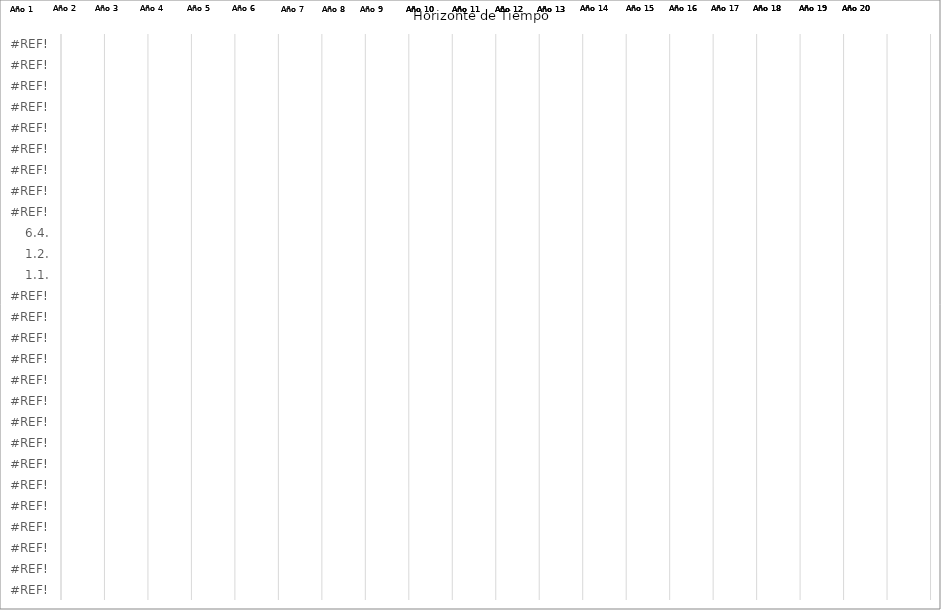
| Category | Series 2 | Series 3 | Series 0 | Series 1 |
|---|---|---|---|---|
| #¡REF! | 0 | 0 | 0 | 0 |
| #¡REF! | 0 | 0 | 0 | 0 |
| #¡REF! | 0 | 0 | 0 | 0 |
| #¡REF! | 0 | 0 | 0 | 0 |
| #¡REF! | 0 | 0 | 0 | 0 |
| #¡REF! | 0 | 0 | 0 | 0 |
| #¡REF! | 0 | 0 | 0 | 0 |
| #¡REF! | 0 | 0 | 0 | 0 |
| #¡REF! | 0 | 0 | 0 | 0 |
| #¡REF! | 0 | 0 | 0 | 0 |
| #¡REF! | 0 | 0 | 0 | 0 |
| #¡REF! | 0 | 0 | 0 | 0 |
| #¡REF! | 0 | 0 | 0 | 0 |
| #¡REF! | 0 | 0 | 0 | 0 |
| #¡REF! | 0 | 0 | 0 | 0 |
| 1.1. | 0 | 0 | 0 | 0 |
| 1.2. | 0 | 0 | 0 | 0 |
| 6.4. | 0 | 0 | 0 | 0 |
| #¡REF! | 0 | 0 | 0 | 0 |
| #¡REF! | 0 | 0 | 0 | 0 |
| #¡REF! | 0 | 0 | 0 | 0 |
| #¡REF! | 0 | 0 | 0 | 0 |
| #¡REF! | 0 | 0 | 0 | 0 |
| #¡REF! | 0 | 0 | 0 | 0 |
| #¡REF! | 0 | 0 | 0 | 0 |
| #¡REF! | 0 | 0 | 0 | 0 |
| #¡REF! | 0 | 0 | 0 | 0 |